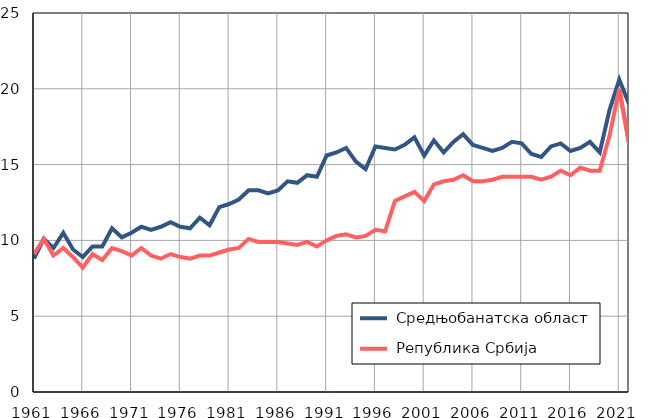
| Category |  Средњобанатска област |  Република Србија |
|---|---|---|
| 1961.0 | 8.8 | 9.1 |
| 1962.0 | 10.1 | 10.1 |
| 1963.0 | 9.5 | 9 |
| 1964.0 | 10.5 | 9.5 |
| 1965.0 | 9.4 | 8.9 |
| 1966.0 | 8.9 | 8.2 |
| 1967.0 | 9.6 | 9.1 |
| 1968.0 | 9.6 | 8.7 |
| 1969.0 | 10.8 | 9.5 |
| 1970.0 | 10.2 | 9.3 |
| 1971.0 | 10.5 | 9 |
| 1972.0 | 10.9 | 9.5 |
| 1973.0 | 10.7 | 9 |
| 1974.0 | 10.9 | 8.8 |
| 1975.0 | 11.2 | 9.1 |
| 1976.0 | 10.9 | 8.9 |
| 1977.0 | 10.8 | 8.8 |
| 1978.0 | 11.5 | 9 |
| 1979.0 | 11 | 9 |
| 1980.0 | 12.2 | 9.2 |
| 1981.0 | 12.4 | 9.4 |
| 1982.0 | 12.7 | 9.5 |
| 1983.0 | 13.3 | 10.1 |
| 1984.0 | 13.3 | 9.9 |
| 1985.0 | 13.1 | 9.9 |
| 1986.0 | 13.3 | 9.9 |
| 1987.0 | 13.9 | 9.8 |
| 1988.0 | 13.8 | 9.7 |
| 1989.0 | 14.3 | 9.9 |
| 1990.0 | 14.2 | 9.6 |
| 1991.0 | 15.6 | 10 |
| 1992.0 | 15.8 | 10.3 |
| 1993.0 | 16.1 | 10.4 |
| 1994.0 | 15.2 | 10.2 |
| 1995.0 | 14.7 | 10.3 |
| 1996.0 | 16.2 | 10.7 |
| 1997.0 | 16.1 | 10.6 |
| 1998.0 | 16 | 12.6 |
| 1999.0 | 16.3 | 12.9 |
| 2000.0 | 16.8 | 13.2 |
| 2001.0 | 15.6 | 12.6 |
| 2002.0 | 16.6 | 13.7 |
| 2003.0 | 15.8 | 13.9 |
| 2004.0 | 16.5 | 14 |
| 2005.0 | 17 | 14.3 |
| 2006.0 | 16.3 | 13.9 |
| 2007.0 | 16.1 | 13.9 |
| 2008.0 | 15.9 | 14 |
| 2009.0 | 16.1 | 14.2 |
| 2010.0 | 16.5 | 14.2 |
| 2011.0 | 16.4 | 14.2 |
| 2012.0 | 15.7 | 14.2 |
| 2013.0 | 15.5 | 14 |
| 2014.0 | 16.2 | 14.2 |
| 2015.0 | 16.4 | 14.6 |
| 2016.0 | 15.9 | 14.3 |
| 2017.0 | 16.1 | 14.8 |
| 2018.0 | 16.5 | 14.6 |
| 2019.0 | 15.8 | 14.6 |
| 2020.0 | 18.6 | 16.9 |
| 2021.0 | 20.6 | 20 |
| 2022.0 | 19 | 16.4 |